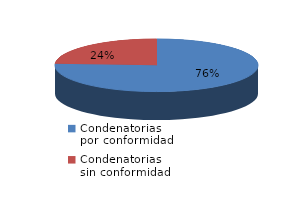
| Category | Series 0 |
|---|---|
| 0 | 984 |
| 1 | 313 |